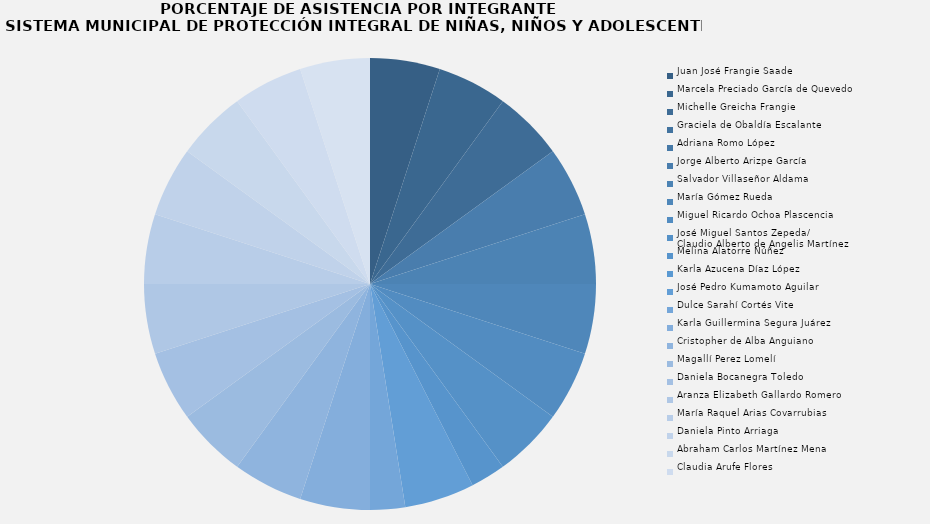
| Category | Juan José Frangie Saade |
|---|---|
| Juan José Frangie Saade | 2 |
| Marcela Preciado García de Quevedo | 2 |
| Michelle Greicha Frangie | 2 |
| Graciela de Obaldía Escalante | 0 |
| Adriana Romo López | 0 |
| Jorge Alberto Arizpe García | 2 |
| Salvador Villaseñor Aldama | 2 |
| María Gómez Rueda | 2 |
| Miguel Ricardo Ochoa Plascencia | 2 |
| José Miguel Santos Zepeda/
Claudio Alberto de Angelis Martínez | 2 |
| Melina Alatorre Núñez | 1 |
| Karla Azucena Díaz López | 0 |
| José Pedro Kumamoto Aguilar | 2 |
| Dulce Sarahí Cortés Vite | 1 |
| Karla Guillermina Segura Juárez | 2 |
| Cristopher de Alba Anguiano | 2 |
| Magallí Perez Lomelí | 2 |
| Daniela Bocanegra Toledo | 2 |
| Aranza Elizabeth Gallardo Romero | 2 |
| María Raquel Arias Covarrubias  | 2 |
| Daniela Pinto Arriaga  | 2 |
| Abraham Carlos Martínez Mena | 2 |
| Claudia Arufe Flores | 2 |
| Ernesto Gerardo Castellanos Silva | 2 |